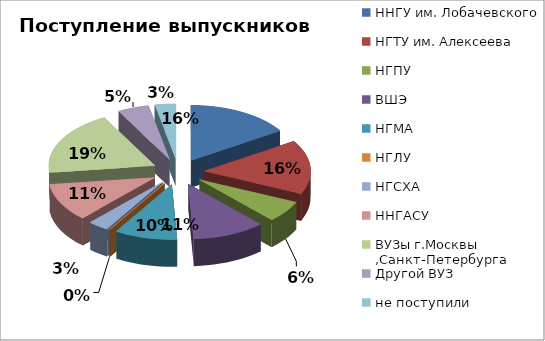
| Category | Series 0 |
|---|---|
| ННГУ им. Лобачевского | 10 |
| НГТУ им. Алексеева | 10 |
| НГПУ | 4 |
| ВШЭ | 7 |
| НГМА | 6 |
| НГЛУ | 0 |
| НГСХА | 2 |
| ННГАСУ | 7 |
| ВУЗы г.Москвы ,Санкт-Петербурга | 12 |
| Другой ВУЗ | 3 |
| не поступили | 2 |